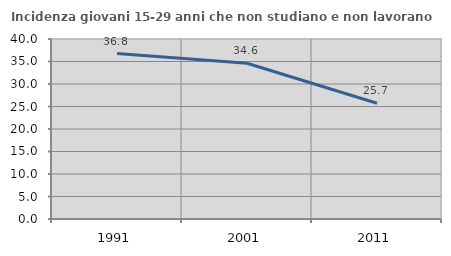
| Category | Incidenza giovani 15-29 anni che non studiano e non lavorano  |
|---|---|
| 1991.0 | 36.765 |
| 2001.0 | 34.622 |
| 2011.0 | 25.731 |